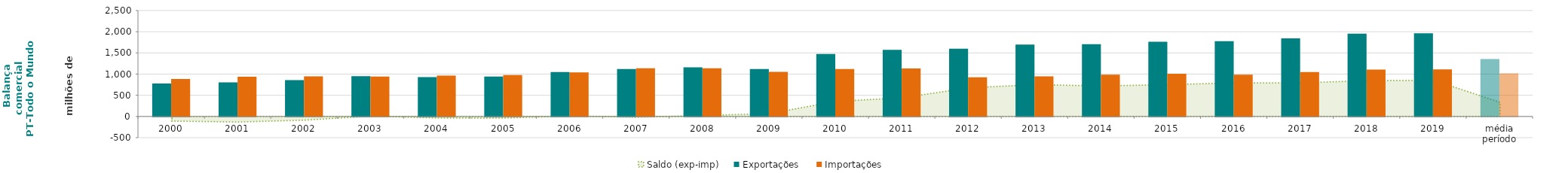
| Category | Exportações  | Importações  |
|---|---|---|
| 2000 | 776.488 | 885.455 |
| 2001 | 804.541 | 935.835 |
| 2002 | 859.148 | 946.093 |
| 2003 | 950.521 | 941.423 |
| 2004 | 929.07 | 965.268 |
| 2005 | 941.439 | 978.108 |
| 2006 | 1050.499 | 1038.979 |
| 2007 | 1119.574 | 1136.141 |
| 2008 | 1158.689 | 1135.721 |
| 2009 | 1118.466 | 1051.061 |
| 2010 | 1474.156 | 1118.572 |
| 2011 | 1572.212 | 1132.138 |
| 2012 | 1601.243 | 924.997 |
| 2013 | 1696.977 | 945.952 |
| 2014 | 1707.833 | 987.107 |
| 2015 | 1762.072 | 1010.417 |
| 2016 | 1776.728 | 984.994 |
| 2017 | 1842.147 | 1050.289 |
| 2018 | 1954.896 | 1108.035 |
| 2019 | 1961.624 | 1109.152 |
| média período | 1352.916 | 1019.287 |